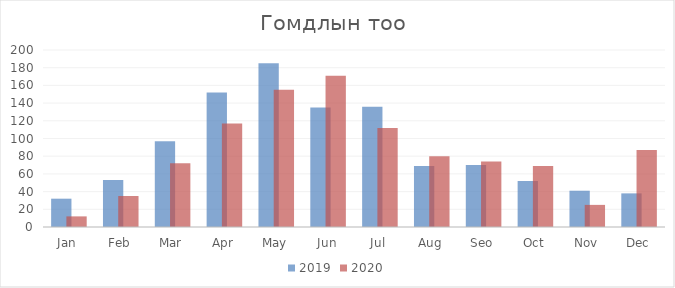
| Category | 2019 | 2020 |
|---|---|---|
| Jan | 32 | 12 |
| Feb | 53 | 35 |
| Mar | 97 | 72 |
| Apr | 152 | 117 |
| May | 185 | 155 |
| Jun | 135 | 171 |
| Jul | 136 | 112 |
| Aug | 69 | 80 |
| Seo | 70 | 74 |
| Oct | 52 | 69 |
| Nov | 41 | 25 |
| Dec | 38 | 87 |